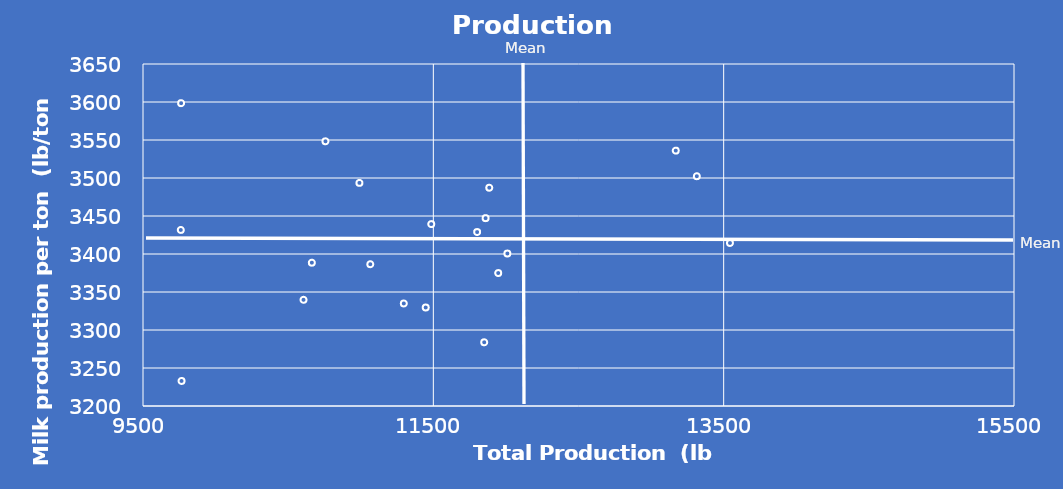
| Category | Series 0 |
|---|---|
| 11850.523902608 | 3283.837 |
| 10663.022460218 | 3388.594 |
| 11946.771895289 | 3374.944 |
| 11801.742902758 | 3428.882 |
| 9760.210828881 | 3431.654 |
| 11885.406017035 | 3487.186 |
| 10756.790423941 | 3548.29 |
| 11065.671337189 | 3386.58 |
| 13169.793855514 | 3536.024 |
| 13315.103846733 | 3502.363 |
| 10990.806516889 | 3493.578 |
| 13543.486165769 | 3414.498 |
| 11485.532003545 | 3439.37 |
| 10605.694911846 | 3339.77 |
| 11447.523328227 | 3329.603 |
| 9762.595371756 | 3598.469 |
| 9765.49927129 | 3232.934 |
| 12009.903770131 | 3400.621 |
| 11296.718060756 | 3334.901 |
| 11860.04835431 | 3447.151 |